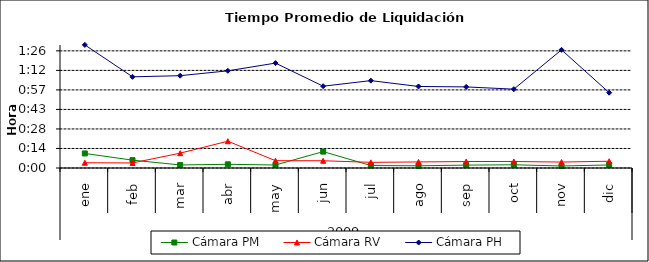
| Category | Cámara PM | Cámara RV | Cámara PH |
|---|---|---|---|
| 0 | 0.007 | 0.003 | 0.063 |
| 1 | 0.004 | 0.003 | 0.047 |
| 2 | 0.002 | 0.008 | 0.047 |
| 3 | 0.002 | 0.014 | 0.05 |
| 4 | 0.002 | 0.004 | 0.054 |
| 5 | 0.008 | 0.004 | 0.042 |
| 6 | 0.001 | 0.003 | 0.045 |
| 7 | 0.001 | 0.003 | 0.042 |
| 8 | 0.001 | 0.003 | 0.042 |
| 9 | 0.002 | 0.003 | 0.04 |
| 10 | 0.001 | 0.003 | 0.061 |
| 11 | 0.002 | 0.003 | 0.039 |